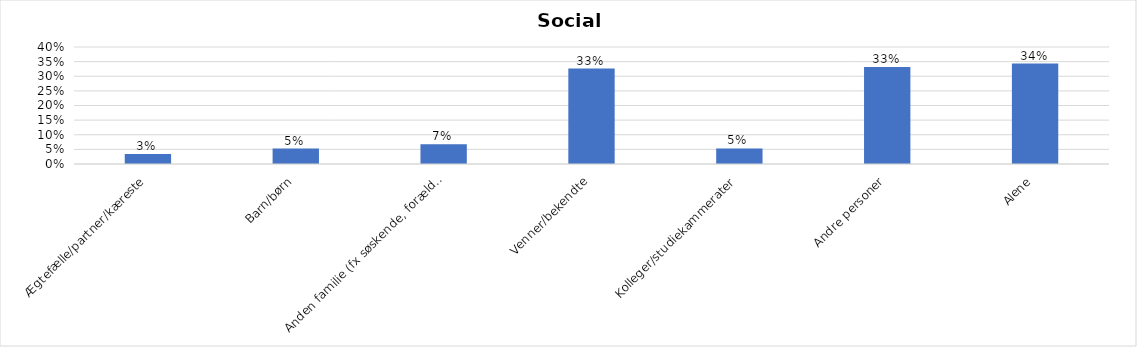
| Category | % |
|---|---|
| Ægtefælle/partner/kæreste | 0.034 |
| Barn/børn | 0.053 |
| Anden familie (fx søskende, forældre) | 0.068 |
| Venner/bekendte | 0.326 |
| Kolleger/studiekammerater | 0.053 |
| Andre personer | 0.332 |
| Alene | 0.344 |